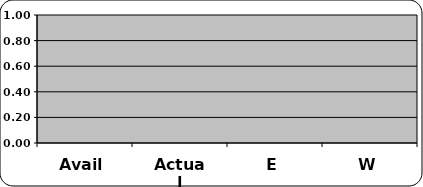
| Category | TOTAL |
|---|---|
| Avail | 0 |
| Actual | 0 |
| E | 0 |
| W | 0 |